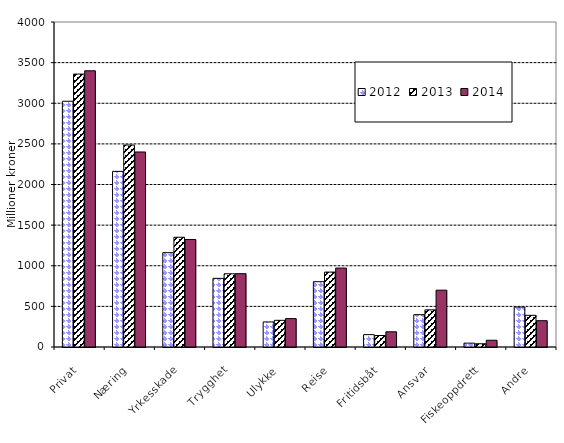
| Category | 2012 | 2013 | 2014 |
|---|---|---|---|
| Privat | 3024.751 | 3359.064 | 3399.607 |
| Næring | 2161.71 | 2485.733 | 2400.37 |
| Yrkesskade | 1161.303 | 1350.935 | 1323.374 |
| Trygghet | 844.894 | 901.239 | 902.33 |
| Ulykke | 308.504 | 328.451 | 349.449 |
| Reise | 803.759 | 922 | 971.58 |
| Fritidsbåt | 152.304 | 141.471 | 187.189 |
| Ansvar | 398.264 | 457.186 | 699.335 |
| Fiskeoppdrett | 47.461 | 40.037 | 83.202 |
| Andre | 491.117 | 389.969 | 323.662 |